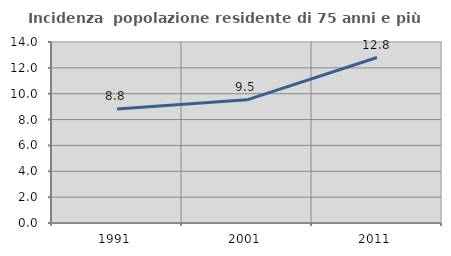
| Category | Incidenza  popolazione residente di 75 anni e più |
|---|---|
| 1991.0 | 8.825 |
| 2001.0 | 9.527 |
| 2011.0 | 12.8 |